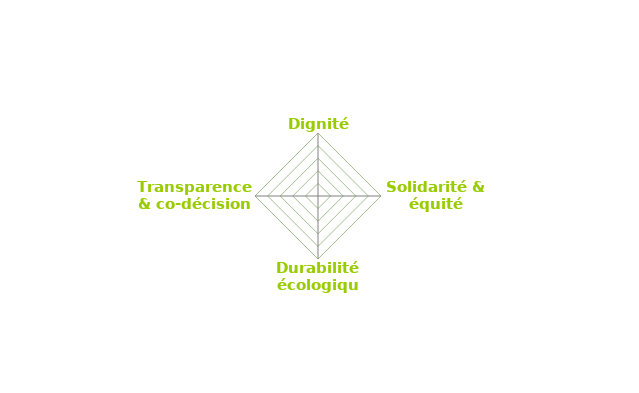
| Category | Series 0 |
|---|---|
| Dignité humaine | 0 |
| Solidarité & équité sociale | 0 |
| Durabilité écologique | 0 |
| Transparence & co-décision | 0 |